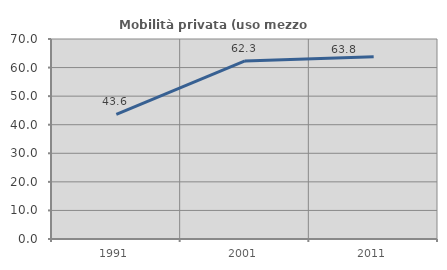
| Category | Mobilità privata (uso mezzo privato) |
|---|---|
| 1991.0 | 43.64 |
| 2001.0 | 62.319 |
| 2011.0 | 63.788 |